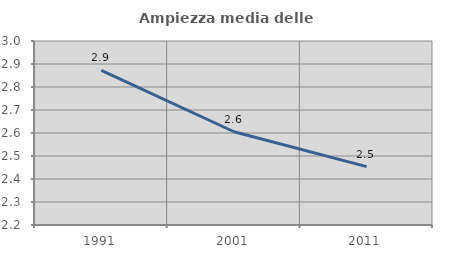
| Category | Ampiezza media delle famiglie |
|---|---|
| 1991.0 | 2.873 |
| 2001.0 | 2.605 |
| 2011.0 | 2.454 |